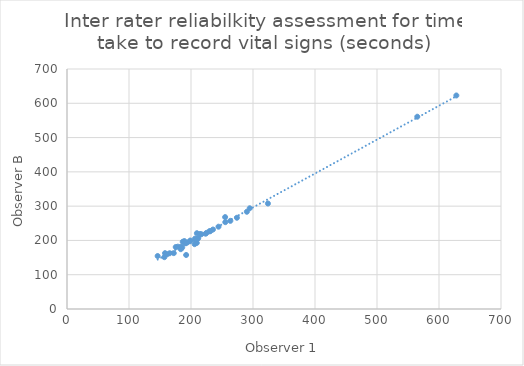
| Category | O2 |
|---|---|
| 231.05000000000047 | 226.857 |
| 209.49699999999717 | 221.017 |
| 274.0699999999993 | 266.13 |
| 175.36700000000138 | 180.717 |
| 290.09999999999644 | 283.62 |
| 165.62999999999874 | 162.62 |
| 161.41699999999872 | 159.687 |
| 178.69000000000278 | 181.767 |
| 189.21000000000453 | 198.176 |
| 158.09299999999132 | 162.823 |
| 146.21300000000943 | 154.544 |
| 627.9869999999978 | 622.777 |
| 255.33299999999528 | 253.277 |
| 191.59300000000457 | 191.674 |
| 244.339999999994 | 240.033 |
| 183.88999999999845 | 181.89 |
| 206.94000000000798 | 201.637 |
| 186.6700000000023 | 196.014 |
| 324.08999999999605 | 307.687 |
| 211.64699999999925 | 206.31 |
| 263.4860000000067 | 257.133 |
| 210.0359999999995 | 204.664 |
| 229.73599999999905 | 226.887 |
| 235.44300000000166 | 231.807 |
| 224.98999999999913 | 222.076 |
| 209.3359999999997 | 192.667 |
| 294.69599999999775 | 293.774 |
| 198.8300000000004 | 199.724 |
| 172.21699999999754 | 162.95 |
| 198.31999999999948 | 197.437 |
| 205.87000000000336 | 189.13 |
| 157.02999999999517 | 151.174 |
| 564.9900000000011 | 560.814 |
| 216.80699999999467 | 217.95 |
| 193.93399999999713 | 194.01 |
| 214.56299999999916 | 218.634 |
| 206.46700000000368 | 205.337 |
| 192.16000000000707 | 157.557 |
| 185.84000000000404 | 179.11 |
| 255.0470000000006 | 268.026 |
| 183.56400000000352 | 174.467 |
| 223.6259999999998 | 219.647 |
| 191.23999999999626 | 192.523 |